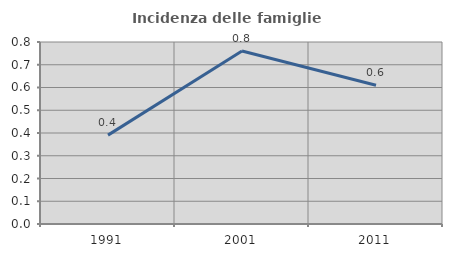
| Category | Incidenza delle famiglie numerose |
|---|---|
| 1991.0 | 0.391 |
| 2001.0 | 0.76 |
| 2011.0 | 0.61 |